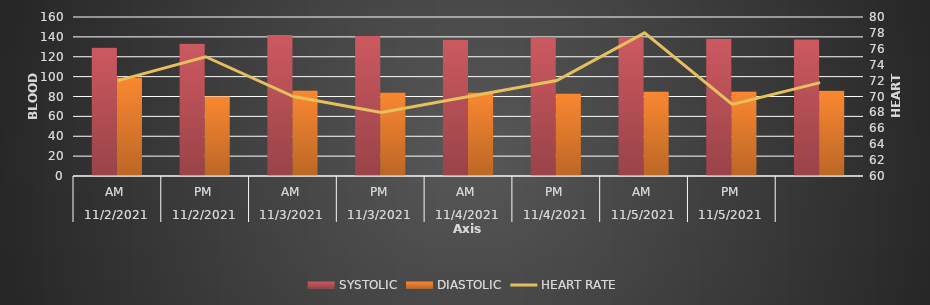
| Category | SYSTOLIC | DIASTOLIC |
|---|---|---|
| 0 | 129 | 99 |
| 1900-01-01 | 133 | 80 |
| 1900-01-02 | 142 | 86 |
| 1900-01-03 | 141 | 84 |
| 1900-01-04 | 137 | 84 |
| 1900-01-05 | 139 | 83 |
| 1900-01-06 | 140 | 85 |
| 1900-01-07 | 138 | 85 |